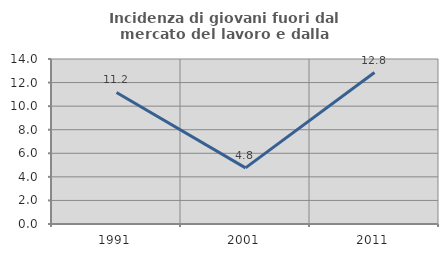
| Category | Incidenza di giovani fuori dal mercato del lavoro e dalla formazione  |
|---|---|
| 1991.0 | 11.163 |
| 2001.0 | 4.762 |
| 2011.0 | 12.849 |